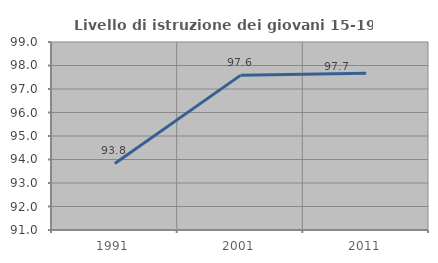
| Category | Livello di istruzione dei giovani 15-19 anni |
|---|---|
| 1991.0 | 93.833 |
| 2001.0 | 97.581 |
| 2011.0 | 97.674 |